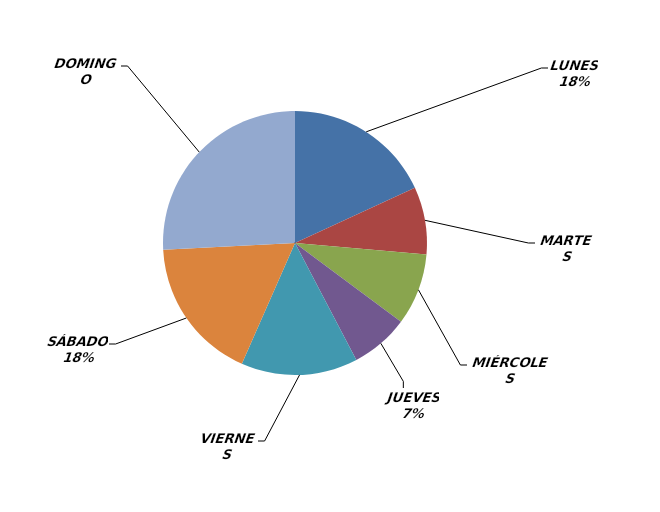
| Category | Series 0 |
|---|---|
| LUNES | 33 |
| MARTES | 15 |
| MIÉRCOLES | 16 |
| JUEVES | 13 |
| VIERNES | 26 |
| SÁBADO | 32 |
| DOMINGO | 47 |